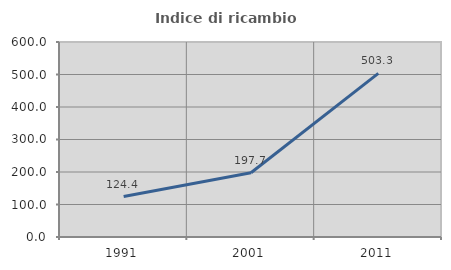
| Category | Indice di ricambio occupazionale  |
|---|---|
| 1991.0 | 124.361 |
| 2001.0 | 197.695 |
| 2011.0 | 503.279 |